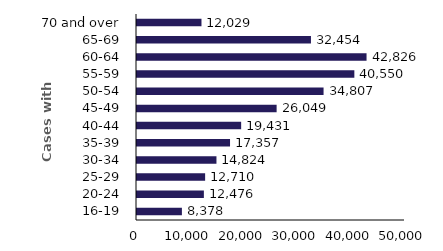
| Category | Series 0 |
|---|---|
| 16-19 | 8378 |
| 20-24 | 12476 |
| 25-29 | 12710 |
| 30-34 | 14824 |
| 35-39 | 17357 |
| 40-44 | 19431 |
| 45-49 | 26049 |
| 50-54 | 34807 |
| 55-59 | 40550 |
| 60-64 | 42826 |
| 65-69 | 32454 |
| 70 and over | 12029 |